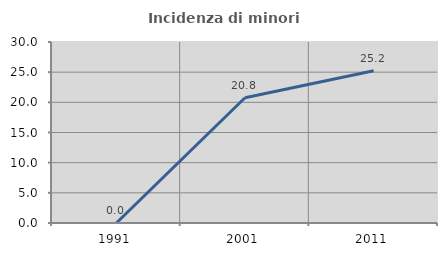
| Category | Incidenza di minori stranieri |
|---|---|
| 1991.0 | 0 |
| 2001.0 | 20.755 |
| 2011.0 | 25.225 |